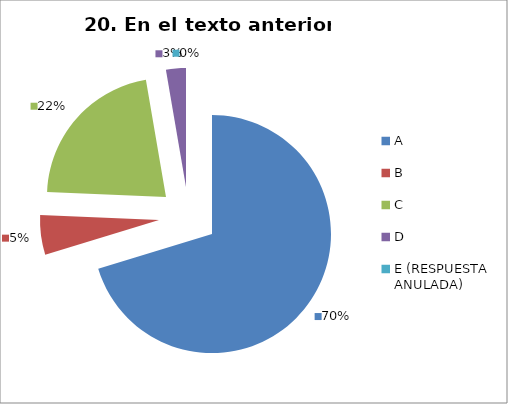
| Category | CANTIDAD DE RESPUESTAS PREGUNTA (20) | PORCENTAJE |
|---|---|---|
| A | 26 | 0.703 |
| B | 2 | 0.054 |
| C | 8 | 0.216 |
| D | 1 | 0.027 |
| E (RESPUESTA ANULADA) | 0 | 0 |